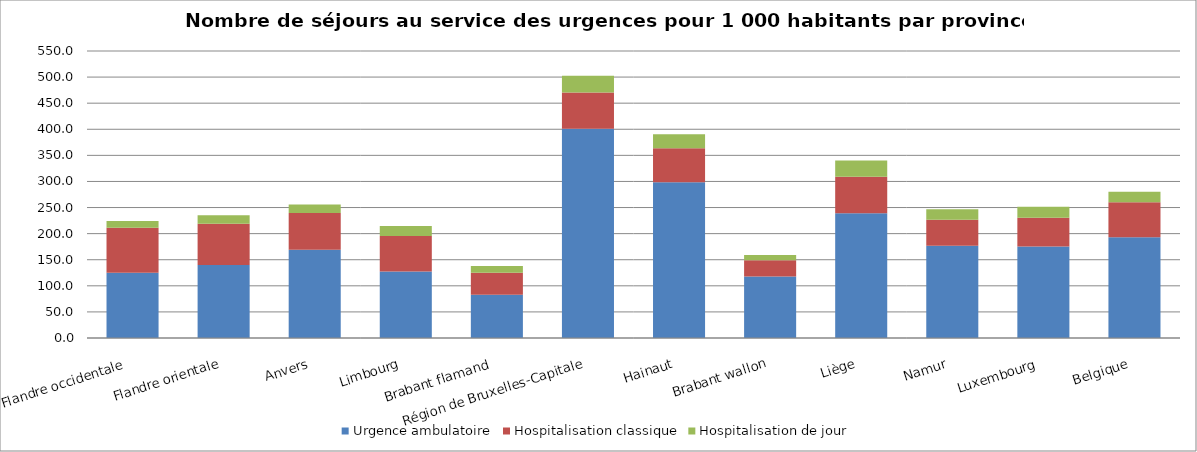
| Category | Urgence ambulatoire | Hospitalisation classique | Hospitalisation de jour |
|---|---|---|---|
| Flandre occidentale | 124.885 | 86.358 | 13.094 |
| Flandre orientale | 139.703 | 79.203 | 16.257 |
| Anvers | 169.351 | 70.263 | 16.455 |
| Limbourg | 127.484 | 67.772 | 19.399 |
| Brabant flamand | 82.887 | 42.37 | 12.56 |
| Région de Bruxelles-Capitale | 401.23 | 69.134 | 31.984 |
| Hainaut | 298.459 | 65.207 | 26.91 |
| Brabant wallon | 117.742 | 31.298 | 9.868 |
| Liège | 239.006 | 69.874 | 31.41 |
| Namur | 176.941 | 49.765 | 19.963 |
| Luxembourg | 175.494 | 54.72 | 21.493 |
| Belgique | 193.294 | 66.796 | 20.255 |